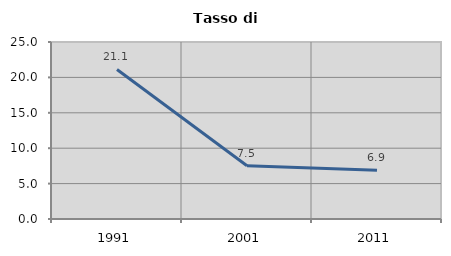
| Category | Tasso di disoccupazione   |
|---|---|
| 1991.0 | 21.127 |
| 2001.0 | 7.522 |
| 2011.0 | 6.897 |